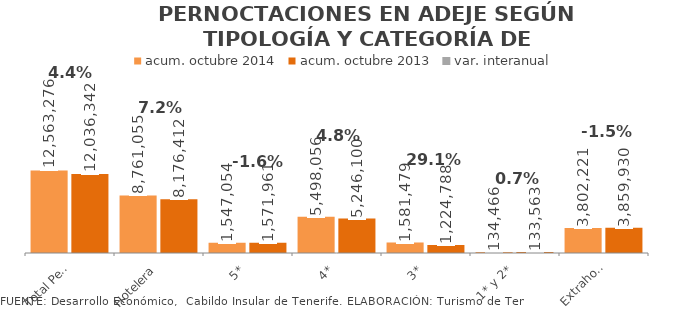
| Category | acum. octubre 2014 | acum. octubre 2013 |
|---|---|---|
| Total Pernoctaciones | 12563276 | 12036342 |
| Hotelera | 8761055 | 8176412 |
| 5* | 1547054 | 1571961 |
| 4* | 5498056 | 5246100 |
| 3* | 1581479 | 1224788 |
| 1* y 2* | 134466 | 133563 |
| Extrahotelera | 3802221 | 3859930 |